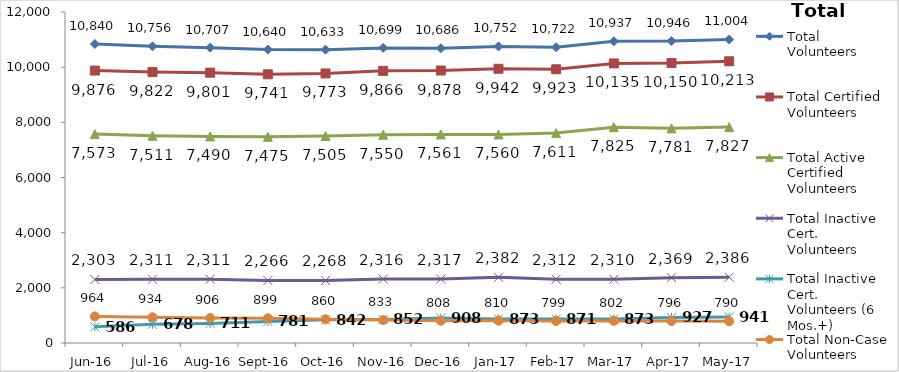
| Category | Total Volunteers | Total Certified Volunteers | Total Active Certified Volunteers | Total Inactive Cert. Volunteers | Total Inactive Cert. Volunteers (6 Mos.+) | Total Non-Case Volunteers |
|---|---|---|---|---|---|---|
| Jun-16 | 10840 | 9876 | 7573 | 2303 | 586 | 964 |
| Jul-16 | 10756 | 9822 | 7511 | 2311 | 678 | 934 |
| Aug-16 | 10707 | 9801 | 7490 | 2311 | 711 | 906 |
| Sep-16 | 10640 | 9741 | 7475 | 2266 | 781 | 899 |
| Oct-16 | 10633 | 9773 | 7505 | 2268 | 842 | 860 |
| Nov-16 | 10699 | 9866 | 7550 | 2316 | 852 | 833 |
| Dec-16 | 10686 | 9878 | 7561 | 2317 | 908 | 808 |
| Jan-17 | 10752 | 9942 | 7560 | 2382 | 873 | 810 |
| Feb-17 | 10722 | 9923 | 7611 | 2312 | 871 | 799 |
| Mar-17 | 10937 | 10135 | 7825 | 2310 | 873 | 802 |
| Apr-17 | 10946 | 10150 | 7781 | 2369 | 927 | 796 |
| May-17 | 11004 | 10213 | 7827 | 2386 | 941 | 790 |